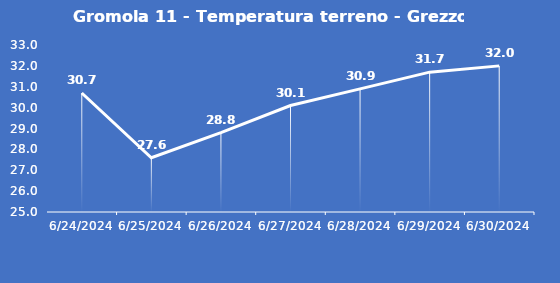
| Category | Gromola 11 - Temperatura terreno - Grezzo (°C) |
|---|---|
| 6/24/24 | 30.7 |
| 6/25/24 | 27.6 |
| 6/26/24 | 28.8 |
| 6/27/24 | 30.1 |
| 6/28/24 | 30.9 |
| 6/29/24 | 31.7 |
| 6/30/24 | 32 |